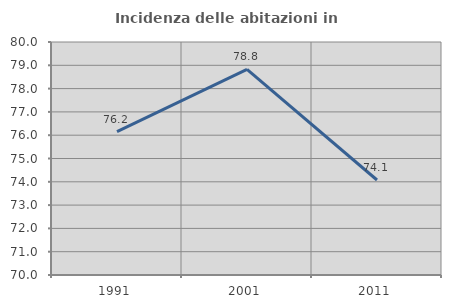
| Category | Incidenza delle abitazioni in proprietà  |
|---|---|
| 1991.0 | 76.158 |
| 2001.0 | 78.829 |
| 2011.0 | 74.077 |